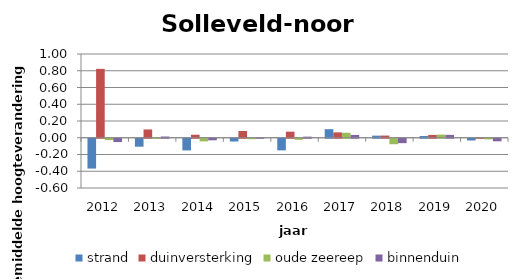
| Category | strand | duinversterking | oude zeereep | binnenduin |
|---|---|---|---|---|
| 2012.0 | -0.356 | 0.822 | -0.017 | -0.04 |
| 2013.0 | -0.095 | 0.099 | 0.008 | 0.015 |
| 2014.0 | -0.139 | 0.036 | -0.032 | -0.018 |
| 2015.0 | -0.033 | 0.08 | -0.006 | 0.003 |
| 2016.0 | -0.138 | 0.073 | -0.013 | 0.013 |
| 2017.0 | 0.102 | 0.064 | 0.06 | 0.033 |
| 2018.0 | 0.025 | 0.026 | -0.065 | -0.052 |
| 2019.0 | 0.02 | 0.034 | 0.038 | 0.034 |
| 2020.0 | -0.021 | 0.004 | -0.008 | -0.031 |